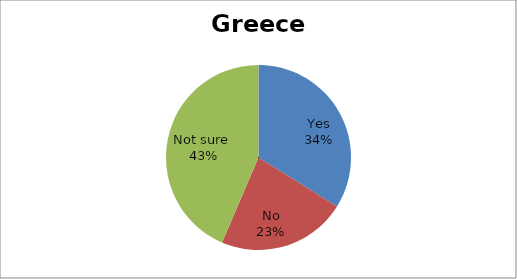
| Category | Series 0 |
|---|---|
| Yes | 21 |
| No | 14 |
| Not sure  | 27 |